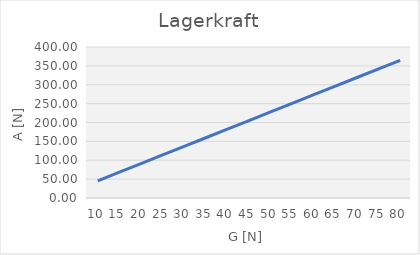
| Category | Series 0 |
|---|---|
| 10.0 | 45.596 |
| 15.0 | 68.394 |
| 20.0 | 91.192 |
| 25.0 | 113.99 |
| 30.0 | 136.789 |
| 35.0 | 159.587 |
| 40.0 | 182.385 |
| 45.0 | 205.183 |
| 50.0 | 227.981 |
| 55.0 | 250.779 |
| 60.0 | 273.577 |
| 65.0 | 296.375 |
| 70.0 | 319.173 |
| 75.0 | 341.971 |
| 80.0 | 364.77 |